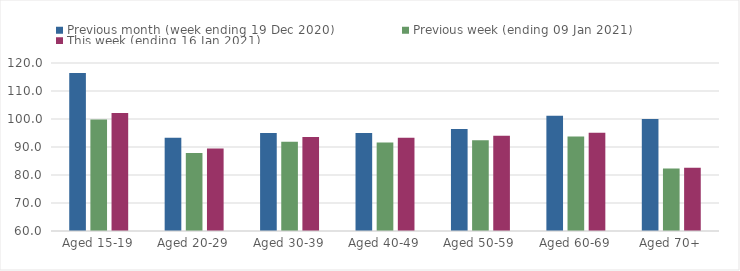
| Category | Previous month (week ending 19 Dec 2020) | Previous week (ending 09 Jan 2021) | This week (ending 16 Jan 2021) |
|---|---|---|---|
| Aged 15-19 | 116.39 | 99.84 | 102.12 |
| Aged 20-29 | 93.34 | 87.86 | 89.42 |
| Aged 30-39 | 94.96 | 91.84 | 93.58 |
| Aged 40-49 | 95.03 | 91.65 | 93.3 |
| Aged 50-59 | 96.4 | 92.4 | 94.03 |
| Aged 60-69 | 101.19 | 93.79 | 95.13 |
| Aged 70+ | 100 | 82.36 | 82.58 |